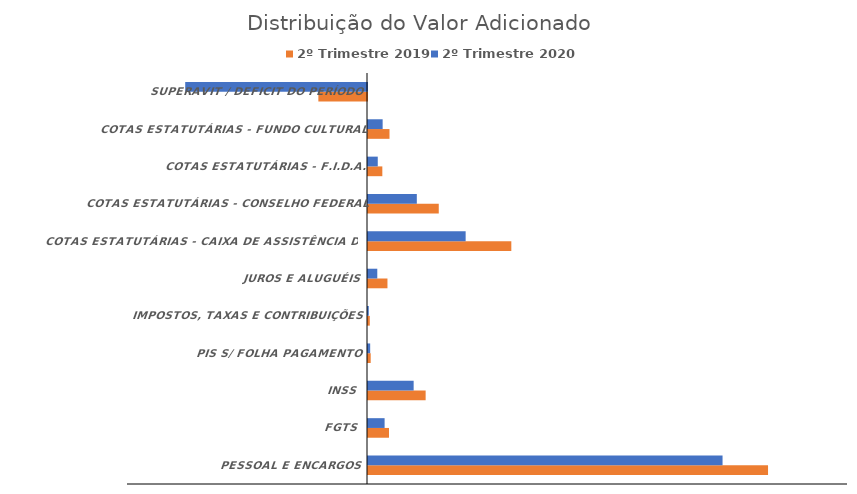
| Category | 2º Trimestre 2019 | 2º Trimestre 2020 |
|---|---|---|
| PESSOAL E ENCARGOS | 5000468.83 | 4431946.31 |
| FGTS | 262192.02 | 207579.71 |
| INSS | 720492.03 | 570605.48 |
| PIS S/ FOLHA PAGAMENTO | 33693.06 | 27228.39 |
| IMPOSTOS, TAXAS E CONTRIBUIÇÕES | 22357.53 | 9657.09 |
| JUROS E ALUGUÉIS | 243240.34 | 116035.36 |
| COTAS ESTATUTÁRIAS - CAIXA DE ASSISTÊNCIA DOS ADVOGADOS | 1791511.82 | 1220568.67 |
| COTAS ESTATUTÁRIAS - CONSELHO FEDERAL | 884474.96 | 610284.35 |
| COTAS ESTATUTÁRIAS - F.I.D.A. | 179151.18 | 122056.87 |
| COTAS ESTATUTÁRIAS - FUNDO CULTURAL | 268726.77 | 183085.3 |
| SUPERAVIT / DEFICIT DO PERÍODO | -607938.79 | -2272224.58 |